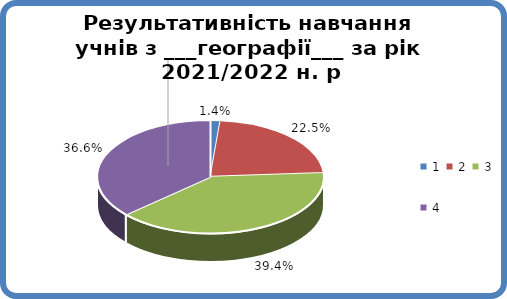
| Category | Series 0 |
|---|---|
| 0 | 0.014 |
| 1 | 0.225 |
| 2 | 0.394 |
| 3 | 0.366 |